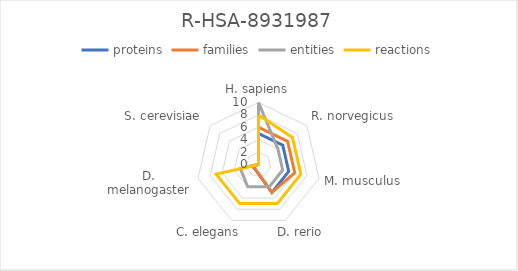
| Category | proteins | families | entities | reactions |
|---|---|---|---|---|
| H. sapiens | 5 | 6 | 10 | 8 |
| R. norvegicus | 5 | 6 | 4 | 7 |
| M. musculus | 5 | 6 | 4 | 7 |
| D. rerio | 5 | 5 | 4 | 7 |
| C. elegans | 1 | 1 | 4 | 7 |
| D. melanogaster | 1 | 1 | 3 | 7 |
| S. cerevisiae | 0 | 0 | 0 | 0 |